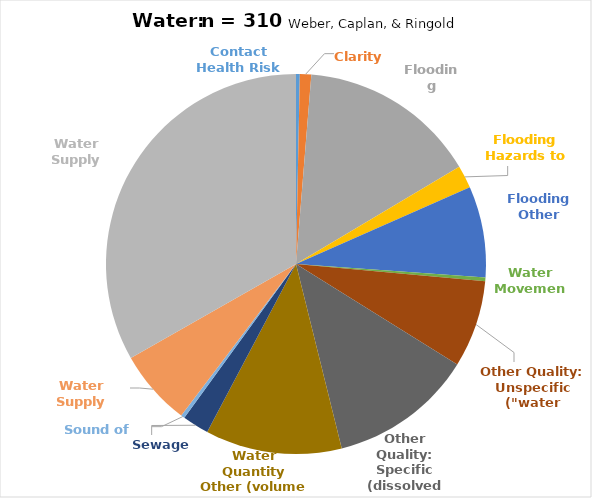
| Category | TOTALS: |
|---|---|
| Contact Health Risk | 1 |
| Clarity | 3 |
| Flooding Damage | 47 |
| Flooding Hazards to Life | 6 |
| Flooding Other (positive) | 24 |
| Water Movement | 1 |
|   | 0 |
| Other Quality: Unspecific ("water quality") | 23 |
| Other Quality: Specific (dissolved oxygen) | 38 |
| Water Quantity Other (volume stats) | 36 |
| Sewage | 7 |
|   | 0 |
| Sound of Water | 1 |
| Water Supply Health Risk | 20 |
| Water Supply Scarcity | 103 |